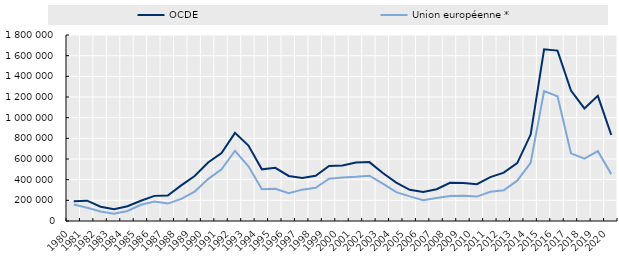
| Category | OCDE | Union européenne * |
|---|---|---|
| 1980.0 | 190529 | 159997 |
| 1981.0 | 196358 | 127564 |
| 1982.0 | 138679 | 91932 |
| 1983.0 | 115012 | 70282 |
| 1984.0 | 142302 | 97373 |
| 1985.0 | 196152 | 156711 |
| 1986.0 | 243156 | 188030 |
| 1987.0 | 246813 | 168459 |
| 1988.0 | 344604 | 213427 |
| 1989.0 | 435813 | 284890 |
| 1990.0 | 566814 | 405281 |
| 1991.0 | 657562 | 500255 |
| 1992.0 | 853314 | 679738 |
| 1993.0 | 730345 | 528805 |
| 1994.0 | 500175 | 306252 |
| 1995.0 | 514947 | 310960 |
| 1996.0 | 436244 | 269588 |
| 1997.0 | 416267 | 303512 |
| 1998.0 | 437215 | 322100 |
| 1999.0 | 531983 | 408577 |
| 2000.0 | 536974 | 420490 |
| 2001.0 | 566722 | 427344 |
| 2002.0 | 569874 | 438461 |
| 2003.0 | 464093 | 360874 |
| 2004.0 | 372116 | 279244 |
| 2005.0 | 302018 | 238107 |
| 2006.0 | 280712 | 201162 |
| 2007.0 | 307184 | 222715 |
| 2008.0 | 369071 | 242480 |
| 2009.0 | 367501 | 243230 |
| 2010.0 | 355964 | 236065 |
| 2011.0 | 424165 | 282210 |
| 2012.0 | 467599 | 297850 |
| 2013.0 | 560645 | 390345 |
| 2014.0 | 836484 | 562675 |
| 2015.0 | 1661490 | 1256610 |
| 2016.0 | 1649300 | 1206435 |
| 2017.0 | 1262300 | 654900 |
| 2018.0 | 1089800 | 602815 |
| 2019.0 | 1211166.277 | 675885 |
| 2020.0 | 832252.311 | 453647 |